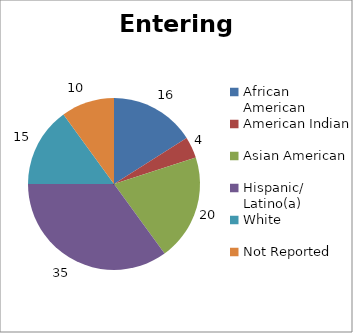
| Category | Entering Workforce |
|---|---|
| African American | 16 |
| American Indian | 4 |
| Asian American | 20 |
| Hispanic/ Latino(a) | 35 |
| White | 15 |
| Not Reported | 10 |